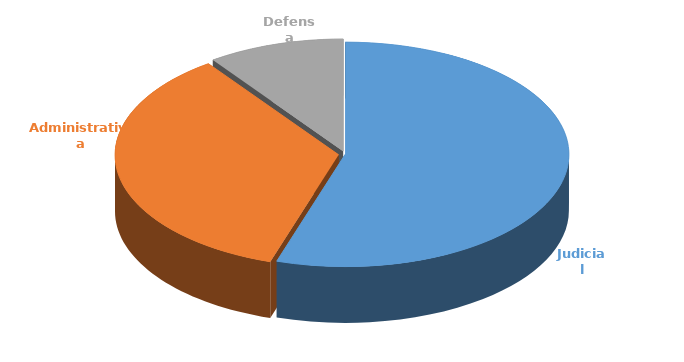
| Category | Cantidad |
|---|---|
| Judicial | 383 |
| Administrativa | 245 |
| Defensa | 69 |